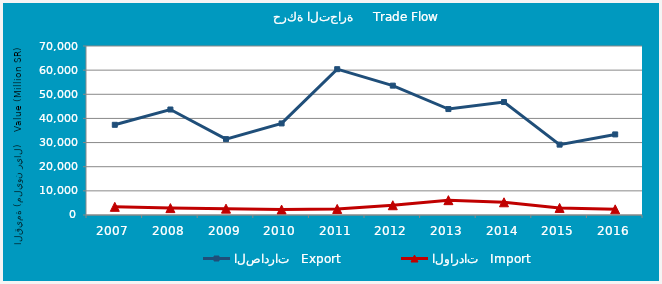
| Category | الصادرات   Export | الواردات   Import |
|---|---|---|
| 2007.0 | 37359.896 | 3381.443 |
| 2008.0 | 43692.656 | 2854.156 |
| 2009.0 | 31429.244 | 2635.313 |
| 2010.0 | 37930.541 | 2242.457 |
| 2011.0 | 60398.112 | 2505.526 |
| 2012.0 | 53581.567 | 4043.841 |
| 2013.0 | 43875.836 | 6141.905 |
| 2014.0 | 46797.6 | 5264.405 |
| 2015.0 | 29145.248 | 2926.294 |
| 2016.0 | 33376.647 | 2343.303 |